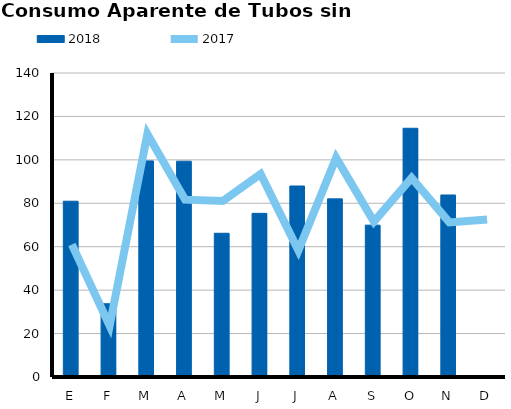
| Category | 2018 |
|---|---|
| E | 80.948 |
| F | 33.723 |
| M | 99.51 |
| A | 99.385 |
| M | 66.19 |
| J | 75.361 |
| J | 87.954 |
| A | 82.037 |
| S | 69.942 |
| O | 114.55 |
| N | 83.821 |
| D | 0 |